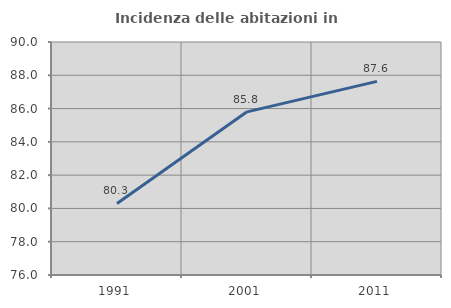
| Category | Incidenza delle abitazioni in proprietà  |
|---|---|
| 1991.0 | 80.301 |
| 2001.0 | 85.804 |
| 2011.0 | 87.634 |